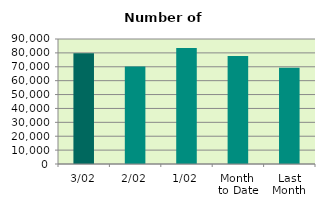
| Category | Series 0 |
|---|---|
| 3/02 | 79686 |
| 2/02 | 70242 |
| 1/02 | 83478 |
| Month 
to Date | 77802 |
| Last
Month | 69227.8 |